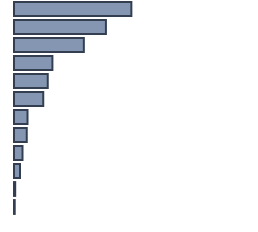
| Category | Percentatge |
|---|---|
| 0 | 48.9 |
| 1 | 38.3 |
| 2 | 29.1 |
| 3 | 16 |
| 4 | 14.1 |
| 5 | 12.2 |
| 6 | 5.6 |
| 7 | 5.3 |
| 8 | 3.5 |
| 9 | 2.5 |
| 10 | 0.5 |
| 11 | 0.3 |